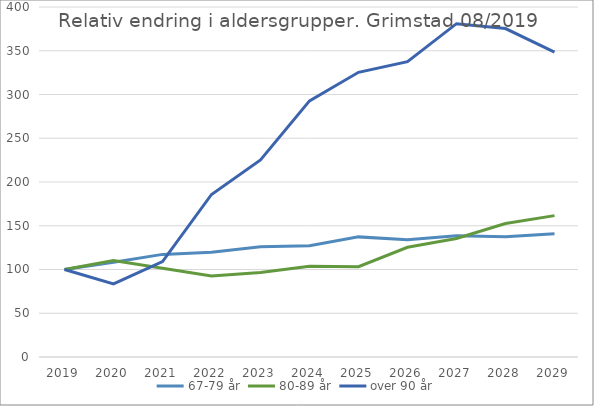
| Category | 67-79 år | 80-89 år | over 90 år |
|---|---|---|---|
| 2019 | 100 | 100 | 100 |
| 2020 | 108.345 | 110.321 | 83.634 |
| 2021 | 117.267 | 101.418 | 109.056 |
| 2022 | 119.782 | 92.686 | 185.759 |
| 2023 | 126.007 | 96.519 | 225.161 |
| 2024 | 127.2 | 103.819 | 292.68 |
| 2025 | 137.278 | 103.134 | 325.378 |
| 2026 | 134.12 | 125.357 | 337.452 |
| 2027 | 138.483 | 135.404 | 380.929 |
| 2028 | 137.328 | 152.594 | 375.367 |
| 2029 | 140.885 | 161.574 | 348.475 |